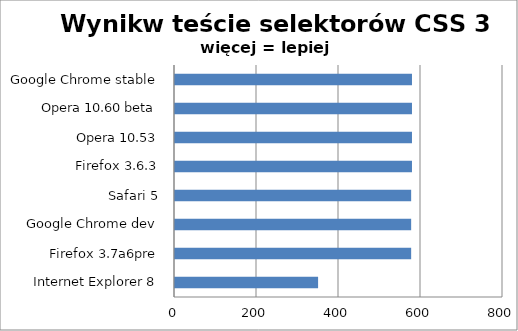
| Category | Series 0 |
|---|---|
| Internet Explorer 8 | 349 |
| Firefox 3.7a6pre | 576 |
| Google Chrome dev | 576 |
| Safari 5 | 576 |
| Firefox 3.6.3 | 578 |
| Opera 10.53 | 578 |
| Opera 10.60 beta | 578 |
| Google Chrome stable | 578 |